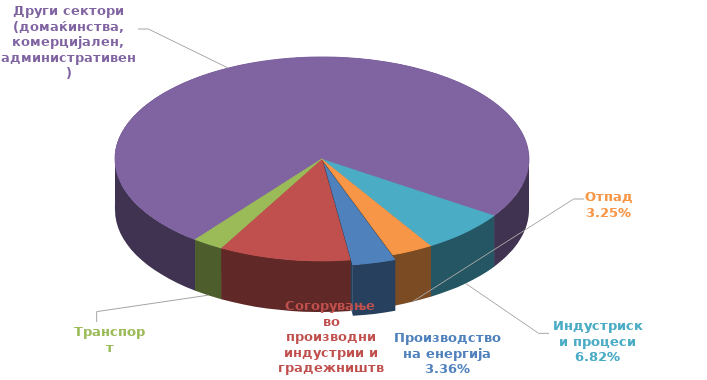
| Category | Series 1 |
|---|---|
| 0 | 0.29 |
| 1 | 0.888 |
| 2 | 0.207 |
| 3 | 6.388 |
| 4 | 0.589 |
| 5 | 0.281 |